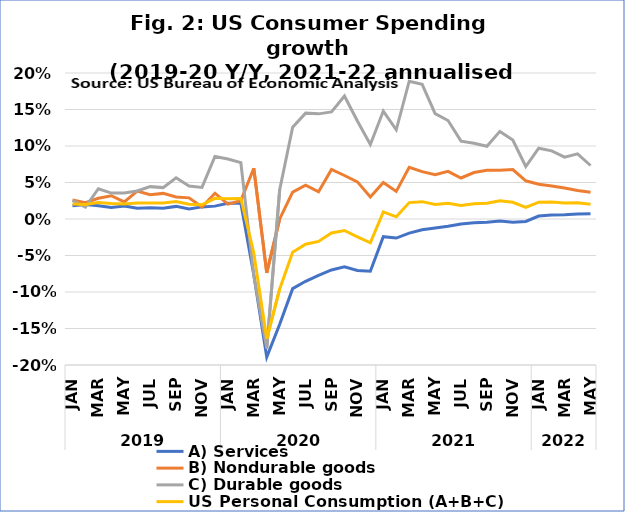
| Category | A) Services | B) Nondurable goods | C) Durable goods | US Personal Consumption (A+B+C) |
|---|---|---|---|---|
| 0 | 0.018 | 0.026 | 0.026 | 0.021 |
| 1 | 0.02 | 0.022 | 0.016 | 0.02 |
| 2 | 0.018 | 0.028 | 0.041 | 0.023 |
| 3 | 0.016 | 0.032 | 0.036 | 0.021 |
| 4 | 0.018 | 0.023 | 0.036 | 0.021 |
| 5 | 0.015 | 0.038 | 0.038 | 0.022 |
| 6 | 0.015 | 0.033 | 0.044 | 0.022 |
| 7 | 0.015 | 0.035 | 0.043 | 0.022 |
| 8 | 0.017 | 0.03 | 0.056 | 0.024 |
| 9 | 0.014 | 0.029 | 0.045 | 0.02 |
| 10 | 0.017 | 0.016 | 0.043 | 0.019 |
| 11 | 0.018 | 0.035 | 0.086 | 0.028 |
| 12 | 0.022 | 0.02 | 0.082 | 0.028 |
| 13 | 0.021 | 0.025 | 0.077 | 0.028 |
| 14 | -0.076 | 0.07 | -0.078 | -0.047 |
| 15 | -0.189 | -0.074 | -0.177 | -0.164 |
| 16 | -0.144 | 0 | 0.04 | -0.096 |
| 17 | -0.095 | 0.037 | 0.126 | -0.046 |
| 18 | -0.085 | 0.046 | 0.145 | -0.035 |
| 19 | -0.077 | 0.037 | 0.144 | -0.031 |
| 20 | -0.07 | 0.068 | 0.147 | -0.019 |
| 21 | -0.066 | 0.06 | 0.168 | -0.016 |
| 22 | -0.071 | 0.051 | 0.134 | -0.024 |
| 23 | -0.072 | 0.03 | 0.102 | -0.033 |
| 24 | -0.024 | 0.05 | 0.148 | 0.01 |
| 25 | -0.026 | 0.038 | 0.122 | 0.003 |
| 26 | -0.019 | 0.071 | 0.189 | 0.022 |
| 27 | -0.015 | 0.065 | 0.184 | 0.024 |
| 28 | -0.012 | 0.061 | 0.144 | 0.02 |
| 29 | -0.01 | 0.065 | 0.135 | 0.022 |
| 30 | -0.007 | 0.056 | 0.107 | 0.019 |
| 31 | -0.005 | 0.064 | 0.104 | 0.021 |
| 32 | -0.004 | 0.067 | 0.1 | 0.022 |
| 33 | -0.003 | 0.067 | 0.12 | 0.025 |
| 34 | -0.004 | 0.068 | 0.108 | 0.023 |
| 35 | -0.003 | 0.052 | 0.072 | 0.016 |
| 36 | 0.004 | 0.048 | 0.097 | 0.023 |
| 37 | 0.006 | 0.045 | 0.093 | 0.023 |
| 38 | 0.006 | 0.042 | 0.085 | 0.022 |
| 39 | 0.007 | 0.039 | 0.089 | 0.022 |
| 40 | 0.007 | 0.037 | 0.073 | 0.02 |